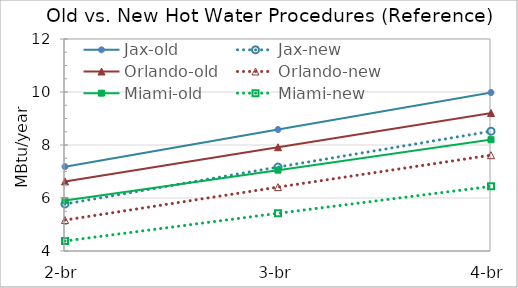
| Category | Jax-old | Jax-new | Orlando-old | Orlando-new | Miami-old | Miami-new |
|---|---|---|---|---|---|---|
| 2-br | 7.183 | 5.775 | 6.627 | 5.168 | 5.902 | 4.378 |
| 3-br | 8.582 | 7.168 | 7.917 | 6.411 | 7.051 | 5.424 |
| 4-br | 9.98 | 8.519 | 9.207 | 7.616 | 8.199 | 6.439 |